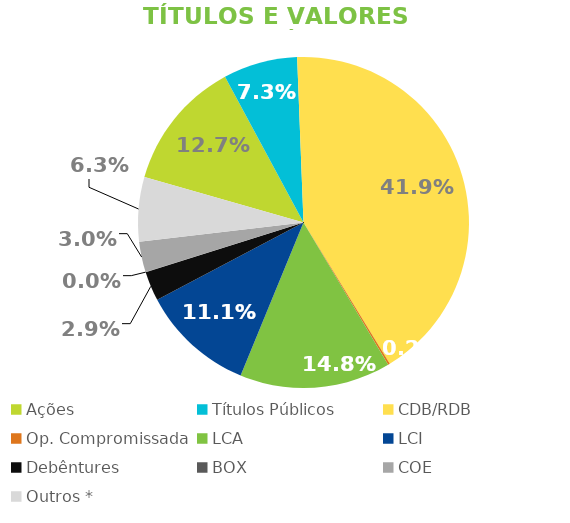
| Category | TVM |
|---|---|
| Ações | 0.127 |
| Títulos Públicos | 0.073 |
| CDB/RDB | 0.419 |
| Op. Compromissada | 0.002 |
| LCA | 0.148 |
| LCI | 0.111 |
| Debêntures | 0.029 |
| BOX | 0 |
| COE | 0.03 |
| Outros * | 0.063 |